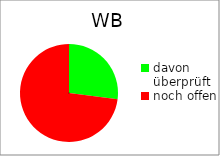
| Category | WB |
|---|---|
| davon überprüft | 10 |
| noch offen | 27 |